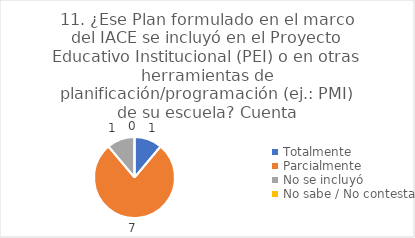
| Category | 11. ¿Ese Plan formulado en el marco del IACE se incluyó en el Proyecto Educativo Institucional (PEI) o en otras herramientas de planificación/programación (ej.: PMI) de su escuela? |
|---|---|
| Totalmente  | 0.111 |
| Parcialmente  | 0.778 |
| No se incluyó  | 0.111 |
| No sabe / No contesta | 0 |